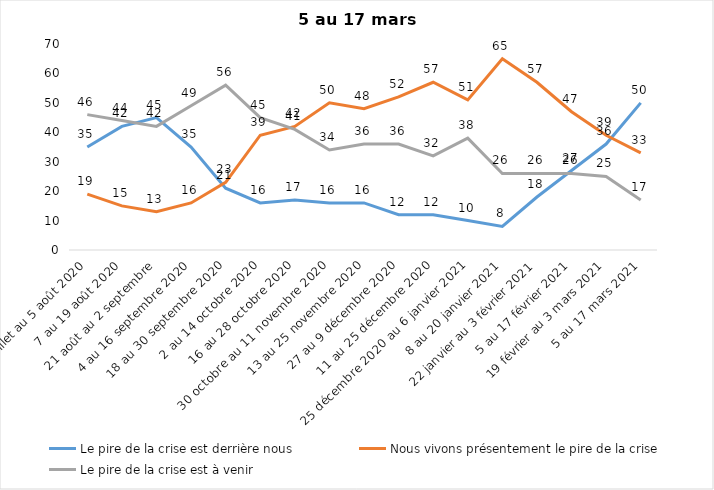
| Category | Le pire de la crise est derrière nous | Nous vivons présentement le pire de la crise | Le pire de la crise est à venir |
|---|---|---|---|
| 24 juillet au 5 août 2020 | 35 | 19 | 46 |
| 7 au 19 août 2020 | 42 | 15 | 44 |
| 21 août au 2 septembre | 45 | 13 | 42 |
| 4 au 16 septembre 2020 | 35 | 16 | 49 |
| 18 au 30 septembre 2020 | 21 | 23 | 56 |
| 2 au 14 octobre 2020 | 16 | 39 | 45 |
| 16 au 28 octobre 2020 | 17 | 42 | 41 |
| 30 octobre au 11 novembre 2020 | 16 | 50 | 34 |
| 13 au 25 novembre 2020 | 16 | 48 | 36 |
| 27 au 9 décembre 2020 | 12 | 52 | 36 |
| 11 au 25 décembre 2020 | 12 | 57 | 32 |
| 25 décembre 2020 au 6 janvier 2021 | 10 | 51 | 38 |
| 8 au 20 janvier 2021 | 8 | 65 | 26 |
| 22 janvier au 3 février 2021 | 18 | 57 | 26 |
| 5 au 17 février 2021 | 27 | 47 | 26 |
| 19 février au 3 mars 2021 | 36 | 39 | 25 |
| 5 au 17 mars 2021 | 50 | 33 | 17 |